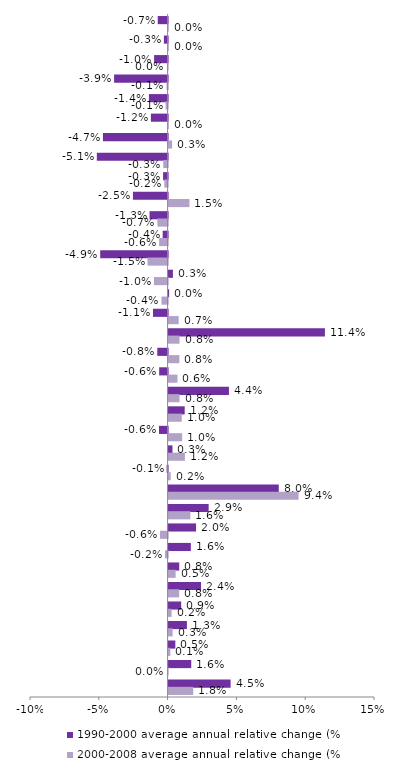
| Category | 1990-2000 average annual relative change (%) | 2000-2008 average annual relative change (%) |
|---|---|---|
| EU-27 | -0.007 | 0 |
| EU-15 | -0.003 | 0 |
| Germany | -0.01 | 0 |
| Romania | -0.039 | -0.001 |
| Poland | -0.014 | -0.001 |
| United Kingdom | -0.012 | 0 |
| Estonia | -0.047 | 0.003 |
| Lithuania | -0.051 | -0.003 |
| France | -0.003 | -0.002 |
| Bulgaria | -0.025 | 0.015 |
| Slovakia | -0.013 | -0.007 |
| Belgium | -0.004 | -0.006 |
| Latvia | -0.049 | -0.015 |
| Hungary | 0.003 | -0.01 |
| Denmark | 0 | -0.004 |
| Croatia | -0.011 | 0.007 |
| Liechtenstein | 0.114 | 0.008 |
| Slovenia | -0.008 | 0.008 |
| Austria | -0.006 | 0.006 |
| Iceland | 0.044 | 0.008 |
| Malta | 0.012 | 0.01 |
| Sweden | -0.006 | 0.01 |
| Switzerland | 0.003 | 0.012 |
| Czech Republic | -0.001 | 0.002 |
| Luxembourg | 0.08 | 0.094 |
| Cyprus | 0.029 | 0.016 |
| Ireland | 0.02 | -0.006 |
| Portugal | 0.016 | -0.002 |
| Finland | 0.008 | 0.005 |
| Norway | 0.024 | 0.008 |
| Netherlands | 0.009 | 0.002 |
| Greece | 0.013 | 0.003 |
| Italy | 0.005 | 0.001 |
| Spain | 0.016 | 0 |
| Turkey | 0.045 | 0.018 |